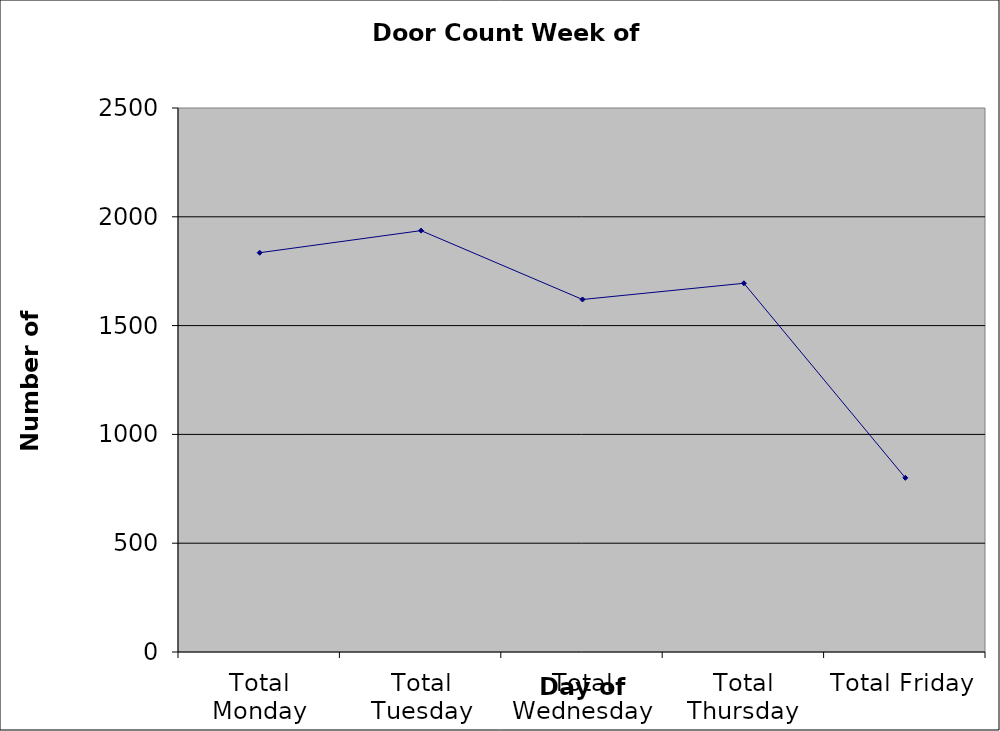
| Category | Series 0 |
|---|---|
| Total Monday | 1835 |
| Total Tuesday | 1936.5 |
| Total Wednesday | 1620 |
| Total Thursday | 1694.5 |
| Total Friday | 800.5 |